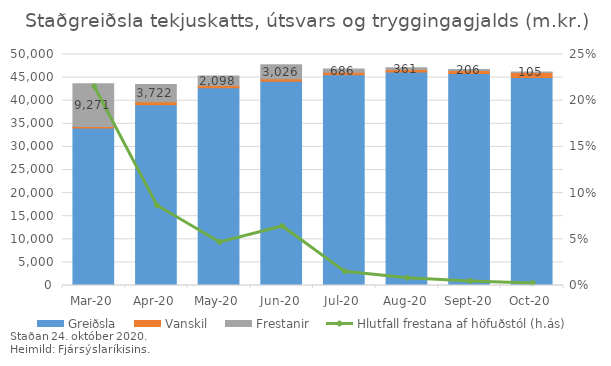
| Category | Greiðsla | Vanskil | Frestanir |
|---|---|---|---|
| 2020-03-01 | 34096.02 | 294.923 | 9271.147 |
| 2020-04-01 | 39132.028 | 657.067 | 3721.536 |
| 2020-05-01 | 42797.813 | 467.494 | 2097.616 |
| 2020-06-01 | 44226.258 | 543.036 | 3025.76 |
| 2020-07-01 | 45594.775 | 571.233 | 685.737 |
| 2020-08-01 | 46233.607 | 526 | 361.34 |
| 2020-09-20 | 45904.994 | 624.891 | 206.009 |
| 2020-10-01 | 44997.474 | 1092 | 105.314 |